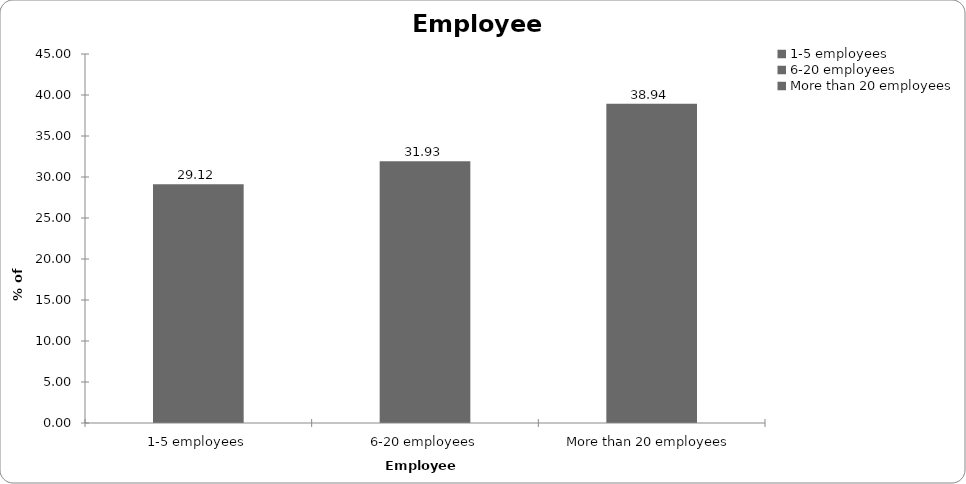
| Category | Employees |
|---|---|
| 1-5 employees | 29.125 |
| 6-20 employees | 31.931 |
| More than 20 employees | 38.945 |